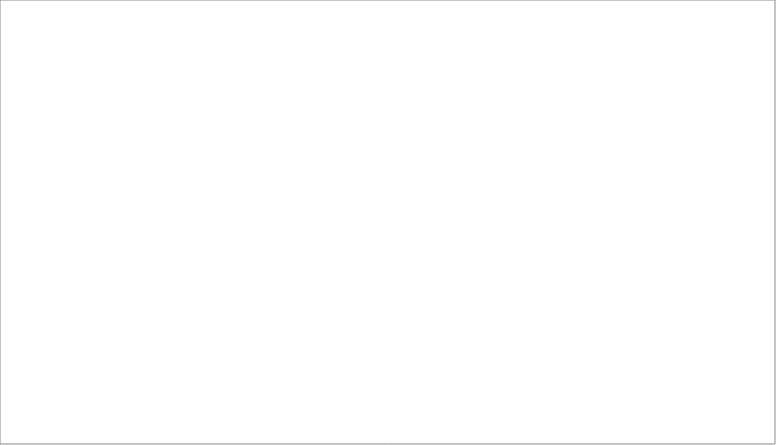
| Category | Series 0 |
|---|---|
| Provisions | 0 |
| Dépôt et caution | 0 |
| Stocks | 0 |
| FDR dispo | 0 |
| Prélèv.& Prov. votés année N | 0 |
| Fragilité | 0 |